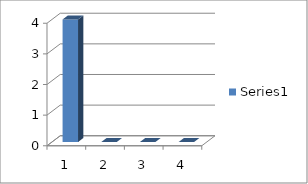
| Category | Series 0 |
|---|---|
| 0 | 4 |
| 1 | 0 |
| 2 | 0 |
| 3 | 0 |